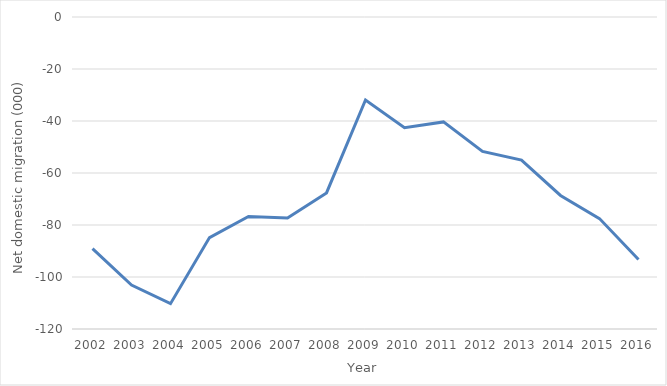
| Category | Series 0 |
|---|---|
| 2002.0 | -89.082 |
| 2003.0 | -103.113 |
| 2004.0 | -110.261 |
| 2005.0 | -84.849 |
| 2006.0 | -76.73 |
| 2007.0 | -77.281 |
| 2008.0 | -67.664 |
| 2009.0 | -31.921 |
| 2010.0 | -42.605 |
| 2011.0 | -40.352 |
| 2012.0 | -51.698 |
| 2013.0 | -55.027 |
| 2014.0 | -68.634 |
| 2015.0 | -77.534 |
| 2016.0 | -93.302 |